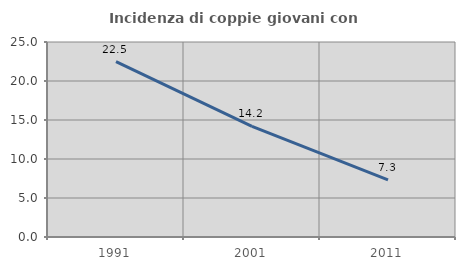
| Category | Incidenza di coppie giovani con figli |
|---|---|
| 1991.0 | 22.481 |
| 2001.0 | 14.177 |
| 2011.0 | 7.335 |